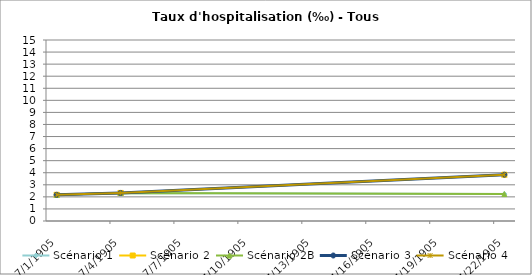
| Category | Scénario 1 | Scénario 2 | Scénario 2B | Scénario 3 | Scénario 4 |
|---|---|---|---|---|---|
| 2009.0 | 2.171 | 2.171 | 2.171 | 2.171 | 2.171 |
| 2012.0 | 2.325 | 2.325 | 2.325 | 2.325 | 2.325 |
| 2030.0 | 2.232 | 3.836 | 2.232 | 3.836 | 3.836 |